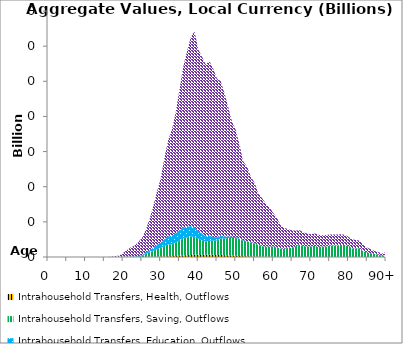
| Category | Intrahousehold Transfers, Health, Outflows | Intrahousehold Transfers, Saving, Outflows | Intrahousehold Transfers, Education, Outflows | Intrahousehold Transfers, Consumption other than health and education, Outflows |
|---|---|---|---|---|
| 0 | 0 | 0 | 0 | 0 |
|  | 0 | 0 | 0 | 0 |
| 2 | 0 | 0 | 0 | 0 |
| 3 | 0 | 0 | 0 | 0 |
| 4 | 0 | 0 | 0 | 0 |
| 5 | 0 | 0 | 0 | 0 |
| 6 | 0 | 0 | 0 | 0 |
| 7 | 0 | 0 | 0 | 0 |
| 8 | 0 | 0 | 0 | 0 |
| 9 | 0 | 0 | 0 | 0 |
| 10 | 0 | 0 | 0 | 0 |
| 11 | 0 | 0 | 0 | 0 |
| 12 | 0 | 0 | 0 | 0 |
| 13 | 0 | 0 | 0 | 0 |
| 14 | 0 | 0 | 0 | 0 |
| 15 | 0 | 0 | 0 | 0 |
| 16 | 0 | 0 | 0 | 0.007 |
| 17 | 0 | 0 | 0.001 | 0.029 |
| 18 | 0 | 0 | 0.002 | 0.052 |
| 19 | 0 | 0 | 0.001 | 0.078 |
| 20 | 0.001 | 0 | 0.005 | 0.227 |
| 21 | 0.002 | 0 | 0.009 | 0.378 |
| 22 | 0.003 | 0 | 0.019 | 0.523 |
| 23 | 0.003 | 0 | 0.026 | 0.609 |
| 24 | 0.004 | 0 | 0.039 | 0.801 |
| 25 | 0.005 | 0.053 | 0.061 | 0.968 |
| 26 | 0.007 | 0.154 | 0.085 | 1.287 |
| 27 | 0.01 | 0.243 | 0.123 | 1.767 |
| 28 | 0.013 | 0.337 | 0.177 | 2.33 |
| 29 | 0.017 | 0.423 | 0.243 | 3.037 |
| 30 | 0.022 | 0.485 | 0.303 | 3.651 |
| 31 | 0.03 | 0.596 | 0.386 | 4.648 |
| 32 | 0.039 | 0.678 | 0.45 | 5.487 |
| 33 | 0.046 | 0.671 | 0.491 | 6.064 |
| 34 | 0.056 | 0.769 | 0.534 | 6.848 |
| 35 | 0.071 | 0.845 | 0.588 | 8.023 |
| 36 | 0.087 | 0.971 | 0.617 | 9.146 |
| 37 | 0.1 | 1.006 | 0.619 | 9.96 |
| 38 | 0.115 | 1.058 | 0.591 | 10.734 |
| 39 | 0.125 | 1 | 0.55 | 11.199 |
| 40 | 0.121 | 0.931 | 0.444 | 10.334 |
| 41 | 0.121 | 0.823 | 0.384 | 10.075 |
| 42 | 0.121 | 0.748 | 0.313 | 9.778 |
| 43 | 0.124 | 0.804 | 0.282 | 9.929 |
| 44 | 0.122 | 0.796 | 0.227 | 9.571 |
| 45 | 0.115 | 0.819 | 0.184 | 9.027 |
| 46 | 0.112 | 0.953 | 0.15 | 8.791 |
| 47 | 0.103 | 0.934 | 0.119 | 8.166 |
| 48 | 0.091 | 0.998 | 0.093 | 7.337 |
| 49 | 0.08 | 0.996 | 0.066 | 6.574 |
| 50 | 0.072 | 1.012 | 0.051 | 6.093 |
| 51 | 0.06 | 0.957 | 0.038 | 5.336 |
| 52 | 0.047 | 0.878 | 0.026 | 4.484 |
| 53 | 0.041 | 0.848 | 0.02 | 4.237 |
| 54 | 0.033 | 0.792 | 0.014 | 3.743 |
| 55 | 0.027 | 0.752 | 0.011 | 3.435 |
| 56 | 0.021 | 0.667 | 0.008 | 2.942 |
| 57 | 0.017 | 0.608 | 0.006 | 2.717 |
| 58 | 0.013 | 0.569 | 0.005 | 2.465 |
| 59 | 0.01 | 0.59 | 0.004 | 2.222 |
| 60 | 0.007 | 0.597 | 0.003 | 1.902 |
| 61 | 0.005 | 0.528 | 0.003 | 1.67 |
| 62 | 0.003 | 0.477 | 0.001 | 1.316 |
| 63 | 0.002 | 0.467 | 0.001 | 1.182 |
| 64 | 0.002 | 0.536 | 0.001 | 1.046 |
| 65 | 0.001 | 0.524 | 0.001 | 0.99 |
| 66 | 0.001 | 0.612 | 0.001 | 0.895 |
| 67 | 0.001 | 0.697 | 0 | 0.824 |
| 68 | 0.001 | 0.622 | 0 | 0.775 |
| 69 | 0 | 0.605 | 0 | 0.733 |
| 70 | 0 | 0.601 | 0 | 0.695 |
| 71 | 0 | 0.632 | 0 | 0.71 |
| 72 | 0 | 0.572 | 0 | 0.694 |
| 73 | 0 | 0.606 | 0 | 0.637 |
| 74 | 0 | 0.585 | 0 | 0.661 |
| 75 | 0 | 0.65 | 0 | 0.635 |
| 76 | 0 | 0.654 | 0 | 0.631 |
| 77 | 0 | 0.666 | 0 | 0.614 |
| 78 | 0 | 0.687 | 0 | 0.606 |
| 79 | 0 | 0.682 | 0 | 0.586 |
| 80 | 0 | 0.621 | 0 | 0.529 |
| 81 | 0 | 0.495 | 0 | 0.502 |
| 82 | 0 | 0.496 | 0 | 0.479 |
| 83 | 0 | 0.49 | 0 | 0.437 |
| 84 | 0 | 0.325 | 0 | 0.353 |
| 85 | 0 | 0.255 | 0 | 0.277 |
| 86 | 0 | 0.219 | 0 | 0.224 |
| 87 | 0 | 0.168 | 0 | 0.17 |
| 88 | 0 | 0.132 | 0 | 0.147 |
| 89 | 0 | 0.077 | 0 | 0.117 |
| 90+ | 0 | 0.124 | 0 | 0.16 |